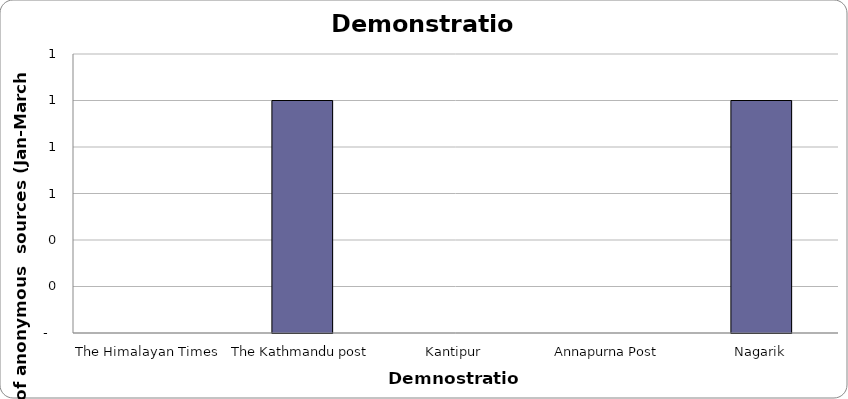
| Category | Demonstration |
|---|---|
| The Himalayan Times | 0 |
| The Kathmandu post | 1 |
| Kantipur | 0 |
| Annapurna Post | 0 |
| Nagarik | 1 |